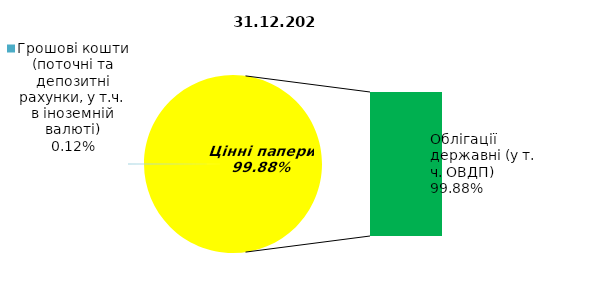
| Category | Series 0 |
|---|---|
| Грошові кошти (поточні та депозитні рахунки, у т.ч. в іноземній валюті) | 0.168 |
| Банківські метали | 0 |
| Нерухомість | 0 |
| Інші активи | 0 |
| Акції | 0 |
| Корпоративні облігації  | 0 |
| Облігації місцевих позик | 0 |
| Облігації державні (у т. ч. ОВДП) | 140.642 |
| Іпотечні сертифікати | 0 |